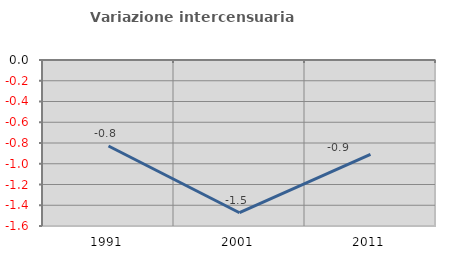
| Category | Variazione intercensuaria annua |
|---|---|
| 1991.0 | -0.829 |
| 2001.0 | -1.472 |
| 2011.0 | -0.91 |